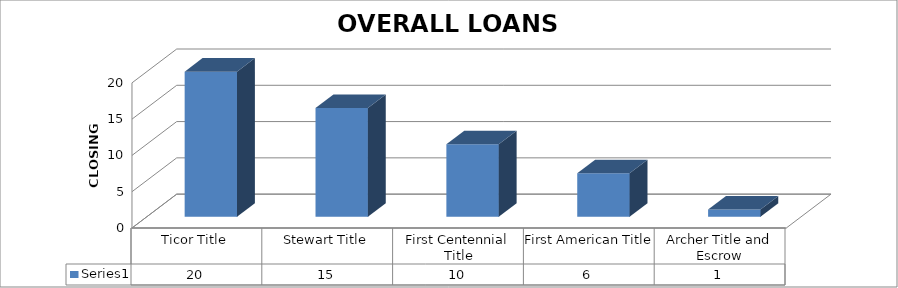
| Category | Series 0 |
|---|---|
| Ticor Title | 20 |
| Stewart Title | 15 |
| First Centennial Title | 10 |
| First American Title | 6 |
| Archer Title and Escrow | 1 |